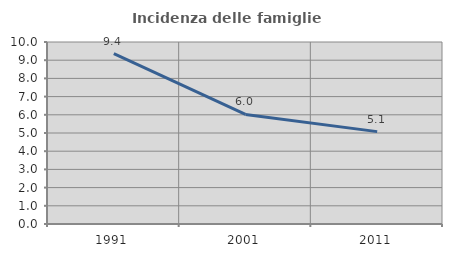
| Category | Incidenza delle famiglie numerose |
|---|---|
| 1991.0 | 9.362 |
| 2001.0 | 6.019 |
| 2011.0 | 5.076 |